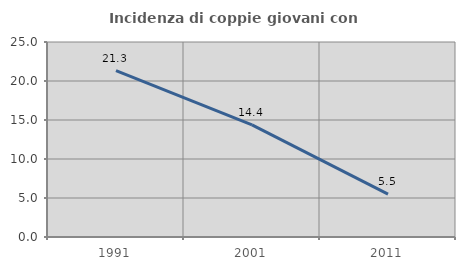
| Category | Incidenza di coppie giovani con figli |
|---|---|
| 1991.0 | 21.328 |
| 2001.0 | 14.367 |
| 2011.0 | 5.499 |